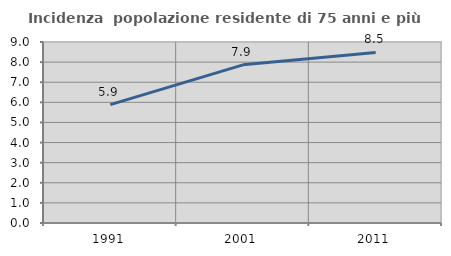
| Category | Incidenza  popolazione residente di 75 anni e più |
|---|---|
| 1991.0 | 5.885 |
| 2001.0 | 7.864 |
| 2011.0 | 8.479 |